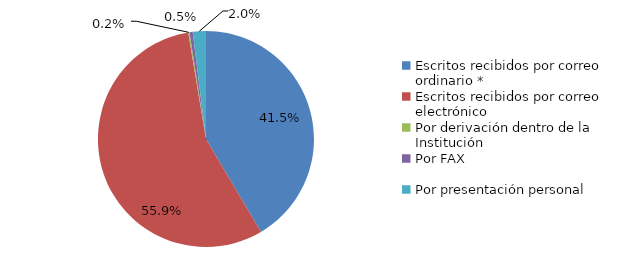
| Category | Series 0 |
|---|---|
| Escritos recibidos por correo ordinario * | 442 |
| Escritos recibidos por correo electrónico | 595 |
| Por derivación dentro de la Institución | 2 |
| Por FAX | 5 |
| Por presentación personal | 21 |